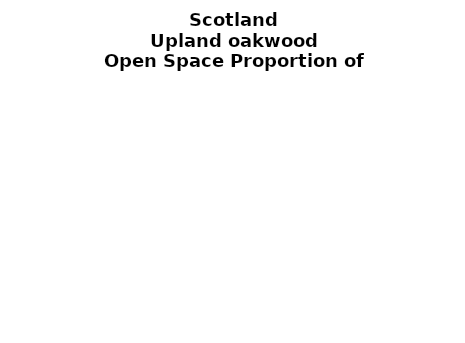
| Category | Upland oakwood |
|---|---|
|  ≥ 10ha, < 10%  | 0.364 |
|   ≥ 10ha, 10-25% | 0.221 |
|   ≥ 10ha, > 25 and <50%  | 0.139 |
|   ≥ 10ha, ≥ 50%  | 0.154 |
|  < 10ha, < 10% | 0.01 |
|  < 10ha, 10-25% | 0.012 |
|  < 10ha, > 25 and < 50% | 0.021 |
|  < 10ha, ≥ 50% | 0.078 |